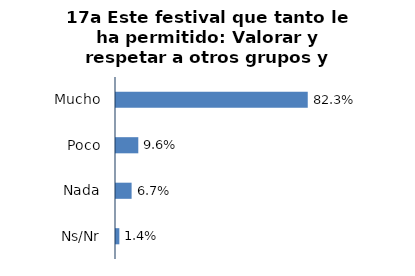
| Category | Series 0 |
|---|---|
| Mucho | 0.823 |
| Poco | 0.096 |
| Nada | 0.067 |
| Ns/Nr | 0.014 |